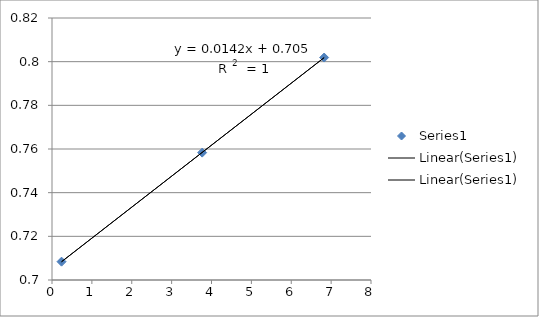
| Category | Series 0 |
|---|---|
| 3.76537355973521 | 0.758 |
| 6.825008883522777 | 0.802 |
| 0.23939760029341872 | 0.708 |